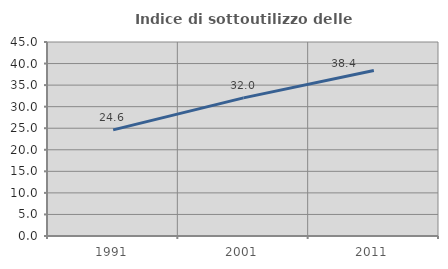
| Category | Indice di sottoutilizzo delle abitazioni  |
|---|---|
| 1991.0 | 24.611 |
| 2001.0 | 32.039 |
| 2011.0 | 38.391 |